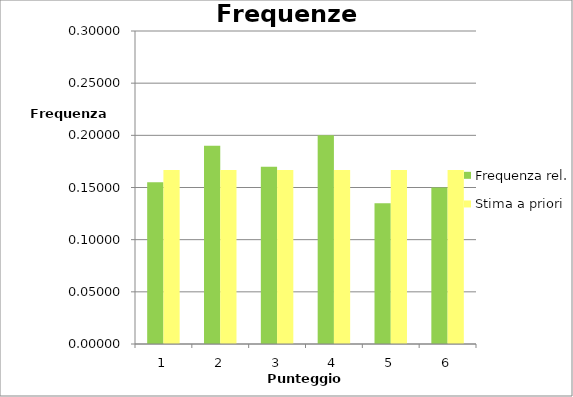
| Category | Frequenza rel. | Stima a priori |
|---|---|---|
| 1.0 | 0.155 | 0.167 |
| 2.0 | 0.19 | 0.167 |
| 3.0 | 0.17 | 0.167 |
| 4.0 | 0.2 | 0.167 |
| 5.0 | 0.135 | 0.167 |
| 6.0 | 0.15 | 0.167 |